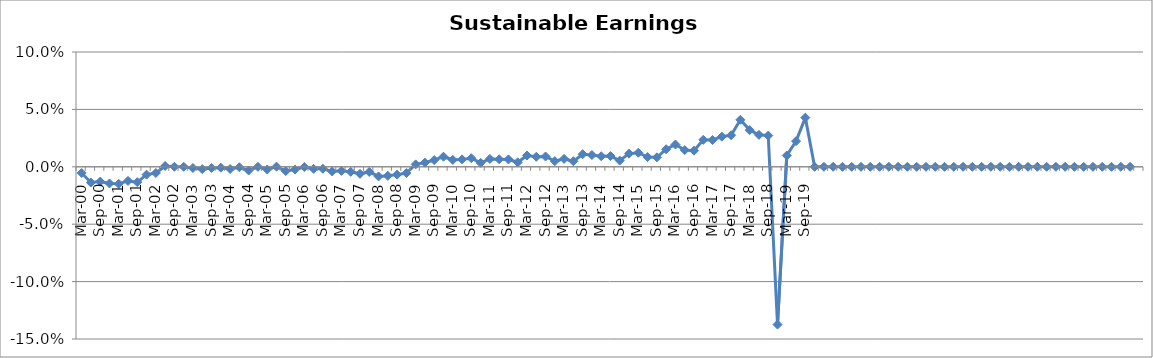
| Category | Sustainable Earnings Indicator |
|---|---|
| Mar-00 | -0.005 |
| Jun-00 | -0.014 |
| Sep-00 | -0.013 |
| Dec-00 | -0.015 |
| Mar-01 | -0.015 |
| Jun-01 | -0.012 |
| Sep-01 | -0.013 |
| Dec-01 | -0.007 |
| Mar-02 | -0.005 |
| Jun-02 | 0.001 |
| Sep-02 | 0 |
| Dec-02 | 0 |
| Mar-03 | -0.001 |
| Jun-03 | -0.002 |
| Sep-03 | -0.001 |
| Dec-03 | -0.001 |
| Mar-04 | -0.002 |
| Jun-04 | 0 |
| Sep-04 | -0.003 |
| Dec-04 | 0 |
| Mar-05 | -0.002 |
| Jun-05 | 0 |
| Sep-05 | -0.004 |
| Dec-05 | -0.002 |
| Mar-06 | 0 |
| Jun-06 | -0.002 |
| Sep-06 | -0.002 |
| Dec-06 | -0.004 |
| Mar-07 | -0.004 |
| Jun-07 | -0.004 |
| Sep-07 | -0.006 |
| Dec-07 | -0.004 |
| Mar-08 | -0.008 |
| Jun-08 | -0.008 |
| Sep-08 | -0.007 |
| Dec-08 | -0.005 |
| Mar-09 | 0.002 |
| Jun-09 | 0.004 |
| Sep-09 | 0.006 |
| Dec-09 | 0.009 |
| Mar-10 | 0.006 |
| Jun-10 | 0.006 |
| Sep-10 | 0.008 |
| Dec-10 | 0.003 |
| Mar-11 | 0.007 |
| Jun-11 | 0.007 |
| Sep-11 | 0.006 |
| Dec-11 | 0.004 |
| Mar-12 | 0.01 |
| Jun-12 | 0.009 |
| Sep-12 | 0.009 |
| Dec-12 | 0.005 |
| Mar-13 | 0.007 |
| Jun-13 | 0.005 |
| Sep-13 | 0.011 |
| Dec-13 | 0.01 |
| Mar-14 | 0.009 |
| Jun-14 | 0.009 |
| Sep-14 | 0.005 |
| Dec-14 | 0.011 |
| Mar-15 | 0.012 |
| Jun-15 | 0.009 |
| Sep-15 | 0.008 |
| Dec-15 | 0.015 |
| Mar-16 | 0.019 |
| Jun-16 | 0.015 |
| Sep-16 | 0.014 |
| Dec-16 | 0.024 |
| Mar-17 | 0.023 |
| Jun-17 | 0.026 |
| Sep-17 | 0.027 |
| Dec-17 | 0.041 |
| Mar-18 | 0.032 |
| Jun-18 | 0.028 |
| Sep-18 | 0.027 |
| Dec-18 | -0.137 |
| Mar-19 | 0.01 |
| Jun-19 | 0.022 |
| Sep-19 | 0.043 |